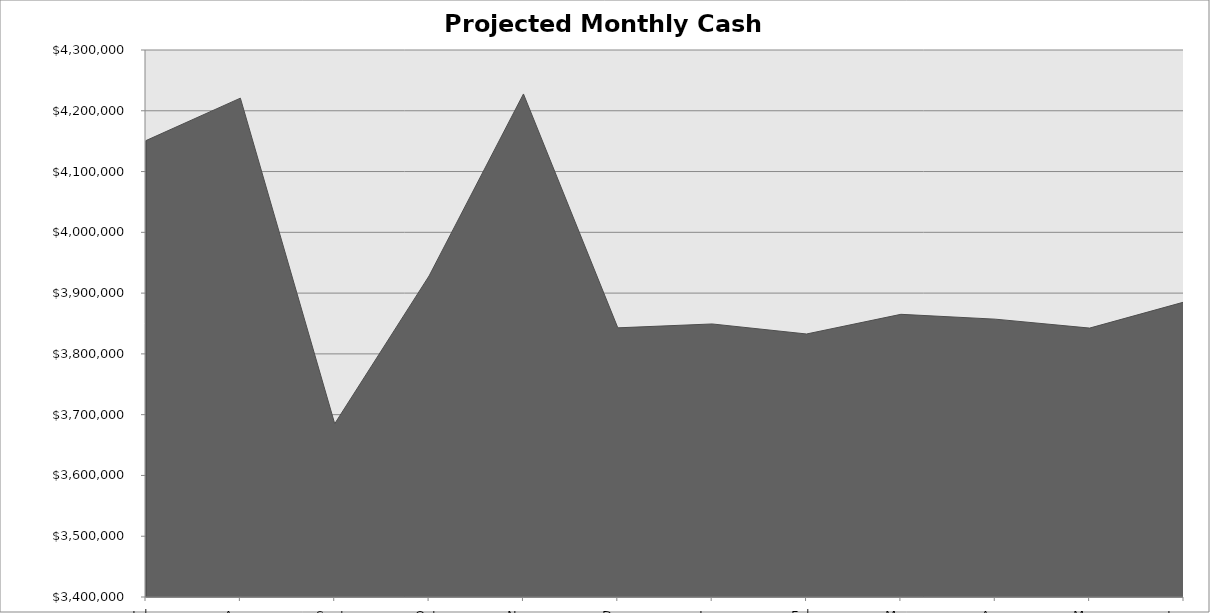
| Category | Projected Monthly Cash Balance |
|---|---|
| July | 4150985.431 |
| Aug | 4220786.472 |
| Sept | 3685109.553 |
| Oct | 3928301.701 |
| Nov | 4227680.485 |
| Dec | 3842856.927 |
| Jan | 3849231.751 |
| Feb | 3832736.263 |
| Mar | 3865092.483 |
| Apr | 3857135.673 |
| May | 3842447.767 |
| June | 3885293.481 |